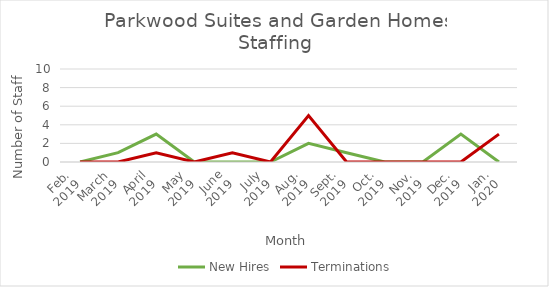
| Category | New Hires | Terminations |
|---|---|---|
| Feb.
2019 | 0 | 0 |
| March
2019 | 1 | 0 |
| April
2019 | 3 | 1 |
| May
2019 | 0 | 0 |
| June
2019 | 0 | 1 |
| July
2019 | 0 | 0 |
| Aug.
2019 | 2 | 5 |
| Sept.
2019 | 1 | 0 |
| Oct.
2019 | 0 | 0 |
| Nov.
2019 | 0 | 0 |
| Dec.
2019 | 3 | 0 |
| Jan.
2020 | 0 | 3 |